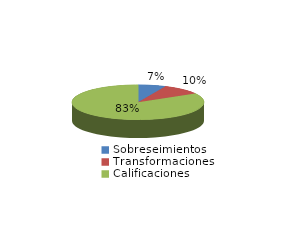
| Category | Series 0 |
|---|---|
| Sobreseimientos | 39 |
| Transformaciones | 57 |
| Calificaciones | 482 |